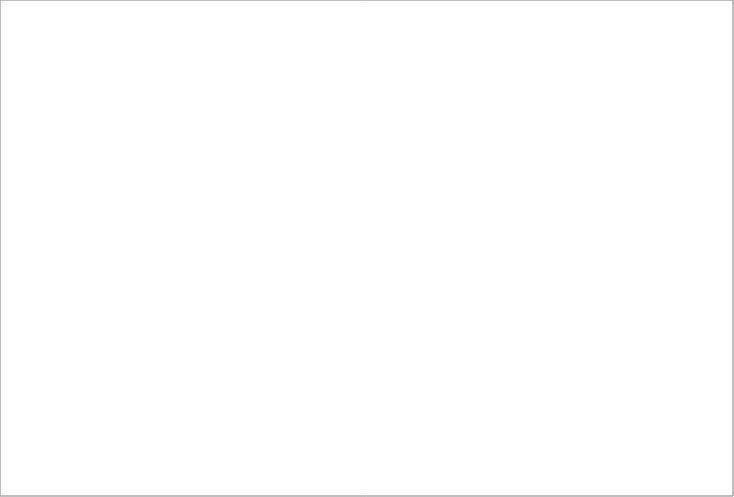
| Category | Series 0 |
|---|---|
| Direct Student Services | 0 |
| Indirect Student Services | 0 |
| Program Planning and School Support | 0 |
| Non-School Counseling Tasks | 0 |